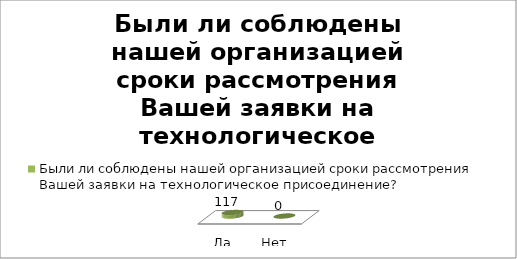
| Category | Были ли соблюдены нашей организацией сроки рассмотрения Вашей заявки на технологическое присоединение? |
|---|---|
| Да | 117 |
| Нет | 0 |